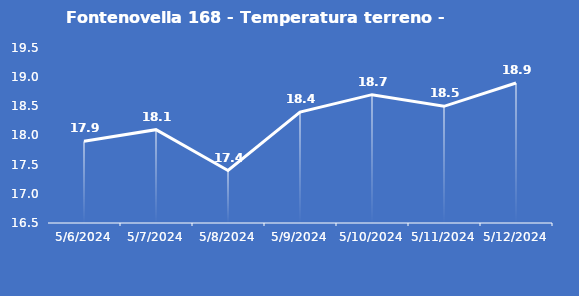
| Category | Fontenovella 168 - Temperatura terreno - Grezzo (°C) |
|---|---|
| 5/6/24 | 17.9 |
| 5/7/24 | 18.1 |
| 5/8/24 | 17.4 |
| 5/9/24 | 18.4 |
| 5/10/24 | 18.7 |
| 5/11/24 | 18.5 |
| 5/12/24 | 18.9 |